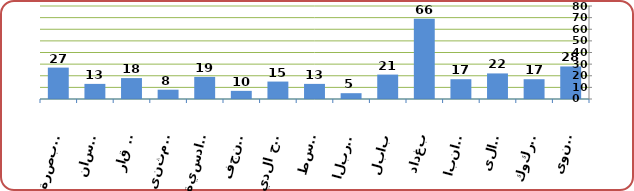
| Category | عدد المكاتب البريدية |
|---|---|
| نينوى | 28 |
| كركوك | 17 |
| ديالى | 22 |
| الانبار | 17 |
| بغداد | 69 |
| بابل | 21 |
| كربلاء | 5 |
| واسط | 13 |
| صلاح الدين | 15 |
| النجف | 7 |
| القادسية | 19 |
| المثنى | 8 |
| ذي قار | 18 |
| ميسان | 13 |
| البصرة | 27 |